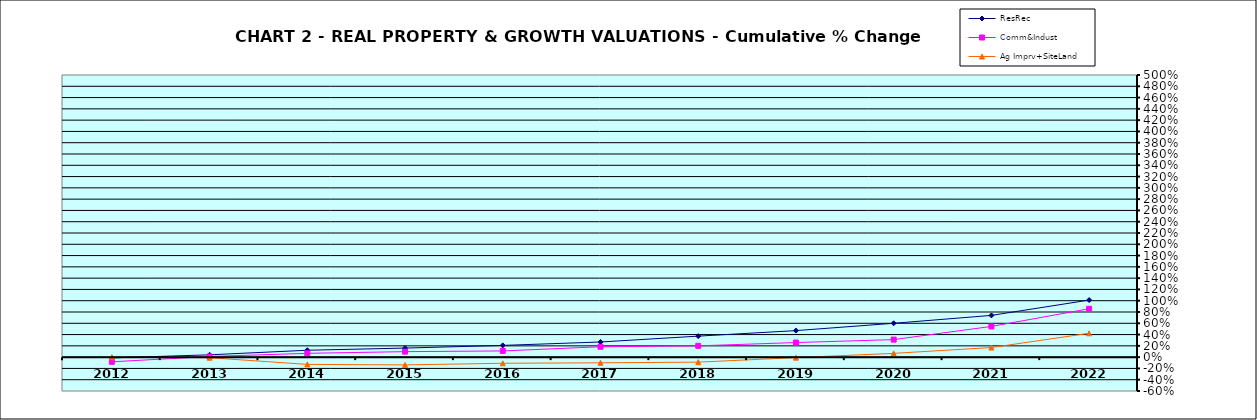
| Category | ResRec | Comm&Indust | Ag Imprv+SiteLand |
|---|---|---|---|
| 2012.0 | -0.014 | -0.083 | 0 |
| 2013.0 | 0.041 | 0.012 | -0.01 |
| 2014.0 | 0.122 | 0.068 | -0.128 |
| 2015.0 | 0.161 | 0.097 | -0.137 |
| 2016.0 | 0.208 | 0.11 | -0.109 |
| 2017.0 | 0.269 | 0.184 | -0.1 |
| 2018.0 | 0.372 | 0.2 | -0.088 |
| 2019.0 | 0.47 | 0.258 | -0.009 |
| 2020.0 | 0.6 | 0.311 | 0.067 |
| 2021.0 | 0.74 | 0.544 | 0.17 |
| 2022.0 | 1.011 | 0.857 | 0.423 |